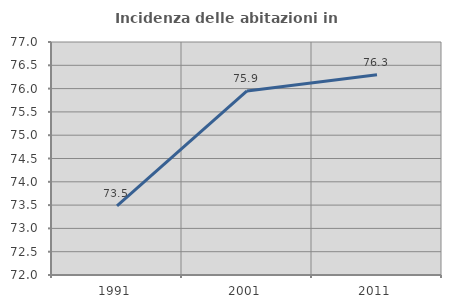
| Category | Incidenza delle abitazioni in proprietà  |
|---|---|
| 1991.0 | 73.481 |
| 2001.0 | 75.949 |
| 2011.0 | 76.295 |